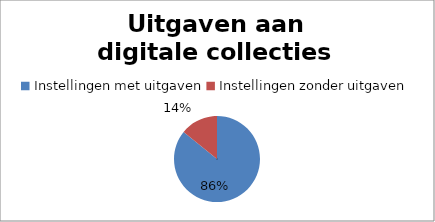
| Category | Series 0 |
|---|---|
| Instellingen met uitgaven | 85 |
| Instellingen zonder uitgaven | 14 |